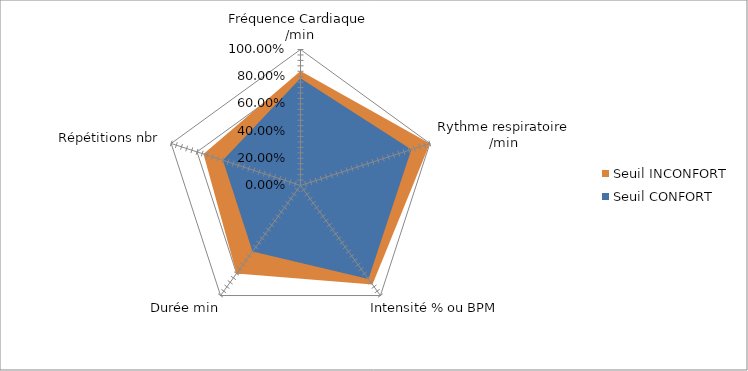
| Category | Seuil INCONFORT | Seuil CONFORT |
|---|---|---|
| Fréquence Cardiaque /min | 0.842 | 0.789 |
| Rythme respiratoire /min | 1 | 0.857 |
| Intensité % ou BPM | 0.9 | 0.85 |
| Durée min | 0.8 | 0.6 |
| Répétitions nbr | 0.75 | 0.6 |